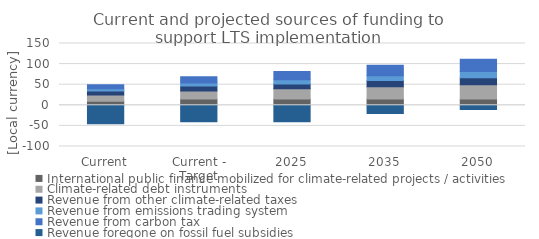
| Category | International public finance mobilized for climate-related projects / activities | Climate-related debt instruments | Revenue from other climate-related taxes | Revenue from emissions trading system | Revenue from carbon tax | Revenue foregone on fossil fuel subsidies |
|---|---|---|---|---|---|---|
| Current | 10 | 15 | 10 | 5 | 10 | -45 |
| Current - Target | 15 | 20 | 12 | 7 | 15 | -40 |
| 2025 | 15 | 25 | 12 | 10 | 20 | -40 |
| 2035 | 15 | 30 | 15 | 12 | 25 | -20 |
| 2050 | 15 | 35 | 17 | 15 | 30 | -10 |